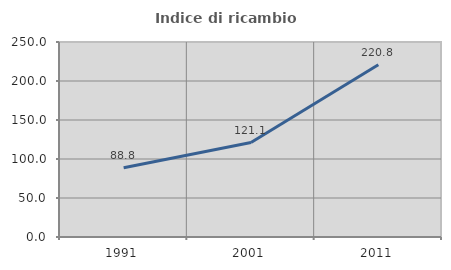
| Category | Indice di ricambio occupazionale  |
|---|---|
| 1991.0 | 88.816 |
| 2001.0 | 121.094 |
| 2011.0 | 220.792 |